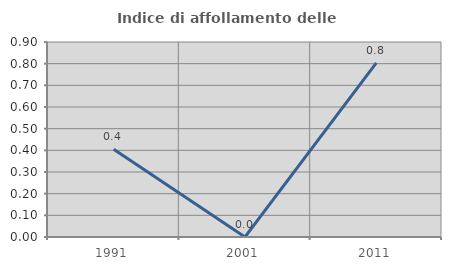
| Category | Indice di affollamento delle abitazioni  |
|---|---|
| 1991.0 | 0.405 |
| 2001.0 | 0 |
| 2011.0 | 0.803 |